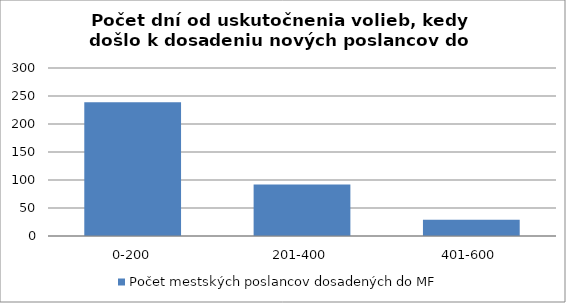
| Category | Počet mestských poslancov dosadených do MF |
|---|---|
| 0-200 | 239 |
| 201-400 | 92 |
| 401-600 | 29 |